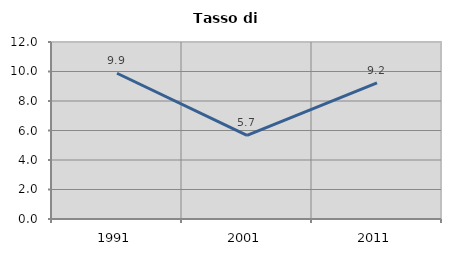
| Category | Tasso di disoccupazione   |
|---|---|
| 1991.0 | 9.881 |
| 2001.0 | 5.674 |
| 2011.0 | 9.236 |